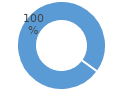
| Category | Series 0 |
|---|---|
| 1.0 | 1 |
| 0.0 | 0 |